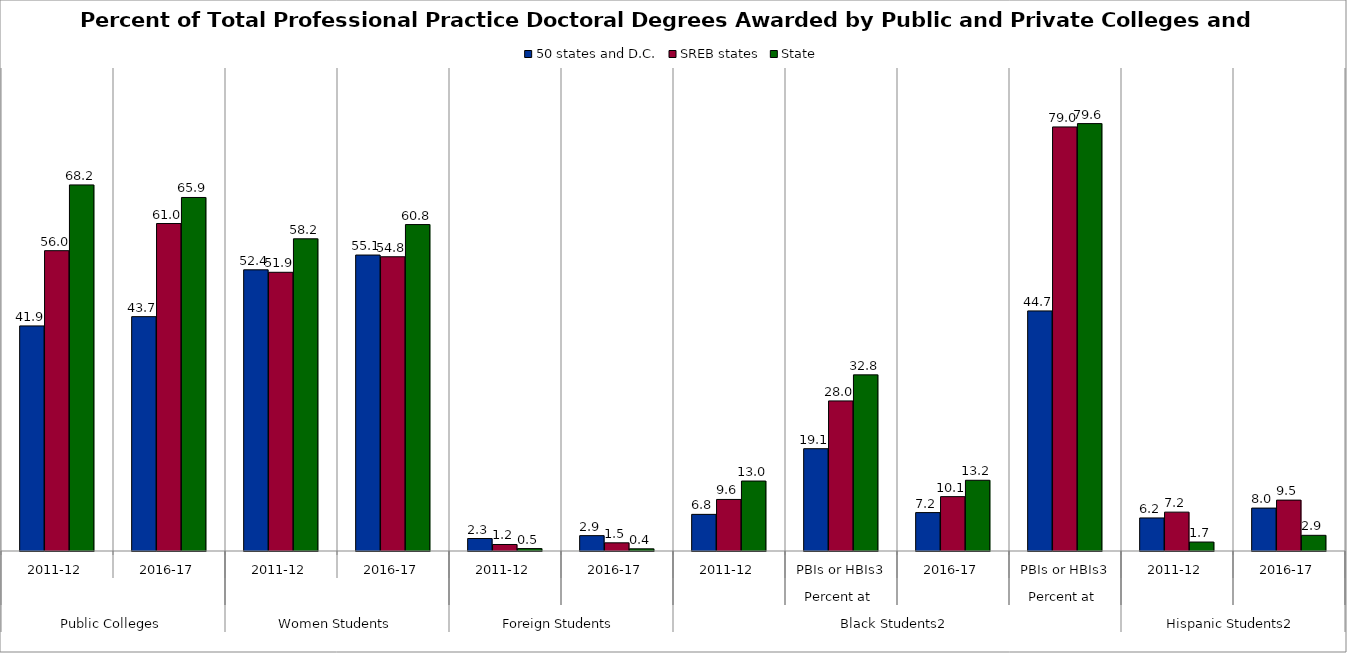
| Category | 50 states and D.C. | SREB states | State |
|---|---|---|---|
| 0 | 41.939 | 55.959 | 68.211 |
| 1 | 43.669 | 61.02 | 65.873 |
| 2 | 52.393 | 51.932 | 58.172 |
| 3 | 55.147 | 54.829 | 60.824 |
| 4 | 2.324 | 1.212 | 0.45 |
| 5 | 2.86 | 1.525 | 0.406 |
| 6 | 6.825 | 9.608 | 13.035 |
| 7 | 19.062 | 27.964 | 32.821 |
| 8 | 7.156 | 10.131 | 13.178 |
| 9 | 44.733 | 79.015 | 79.638 |
| 10 | 6.157 | 7.243 | 1.671 |
| 11 | 7.996 | 9.482 | 2.922 |